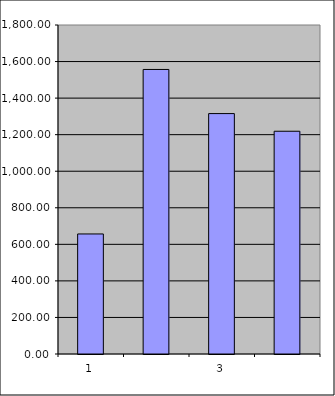
| Category | Series 0 |
|---|---|
| 0 | 656.75 |
| 1 | 1556.772 |
| 2 | 1315.302 |
| 3 | 1218.709 |